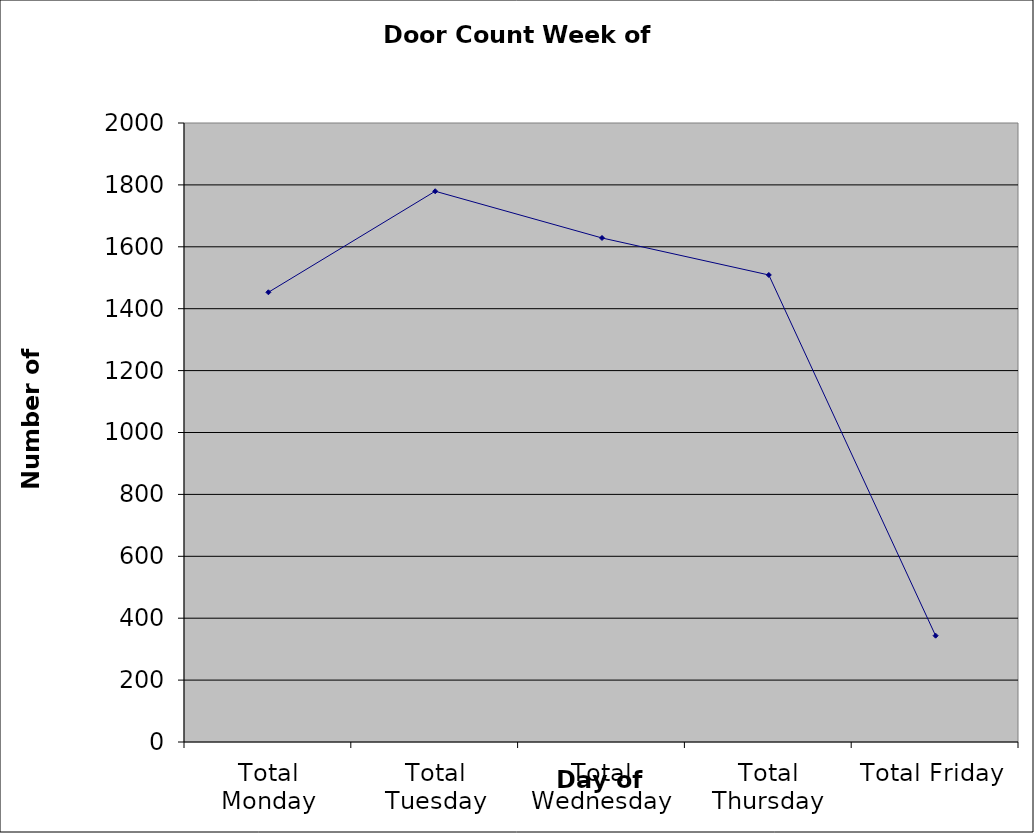
| Category | Series 0 |
|---|---|
| Total Monday | 1453 |
| Total Tuesday | 1779.5 |
| Total Wednesday | 1628.5 |
| Total Thursday | 1509 |
| Total Friday | 343.5 |